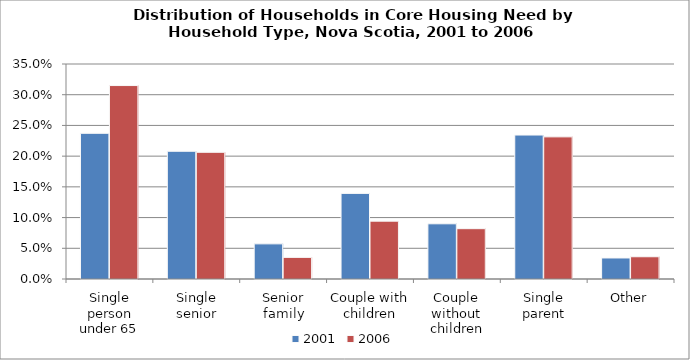
| Category | 2001 | 2006 |
|---|---|---|
| Single person under 65 | 0.237 | 0.315 |
| Single senior | 0.208 | 0.206 |
| Senior family | 0.057 | 0.035 |
| Couple with children | 0.139 | 0.094 |
| Couple without children | 0.09 | 0.082 |
| Single parent | 0.234 | 0.231 |
| Other | 0.034 | 0.036 |